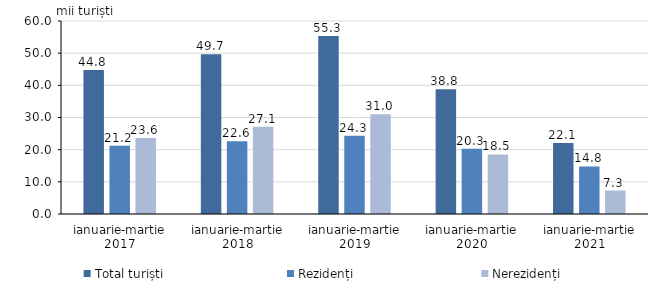
| Category | Total turiști | Rezidenți  | Nerezidenți  |
|---|---|---|---|
| ianuarie-martie 2017 | 44.8 | 21.2 | 23.6 |
| ianuarie-martie 2018 | 49.7 | 22.6 | 27.1 |
| ianuarie-martie 2019 | 55.3 | 24.3 | 31 |
| ianuarie-martie 2020 | 38.8 | 20.3 | 18.5 |
| ianuarie-martie 2021 | 22.1 | 14.8 | 7.3 |